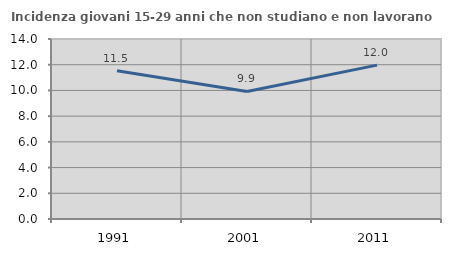
| Category | Incidenza giovani 15-29 anni che non studiano e non lavorano  |
|---|---|
| 1991.0 | 11.538 |
| 2001.0 | 9.917 |
| 2011.0 | 11.966 |